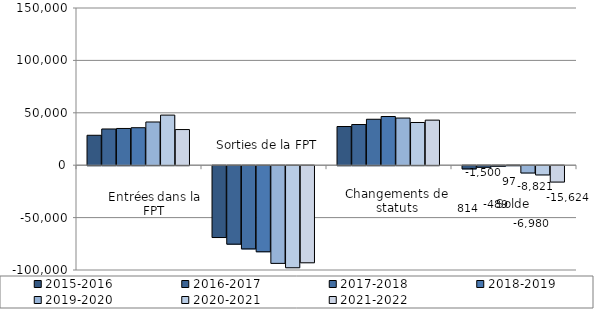
| Category | 2015-2016 | 2016-2017 | 2017-2018 | 2018-2019 | 2019-2020 | 2020-2021 | 2021-2022 |
|---|---|---|---|---|---|---|---|
| Entrées | 28555 | 34565 | 35056 | 35765 | 41233 | 47809 | 34018 |
| Sorties | -68555 | -74877 | -79389 | -82137 | -93204 | -97389 | -92649 |
| Changement de statut | 36926 | 38812 | 43844 | 46469 | 44991 | 40759 | 43007 |
| Solde | -3074 | -1500 | -489 | 97 | -6980 | -8821 | -15624 |